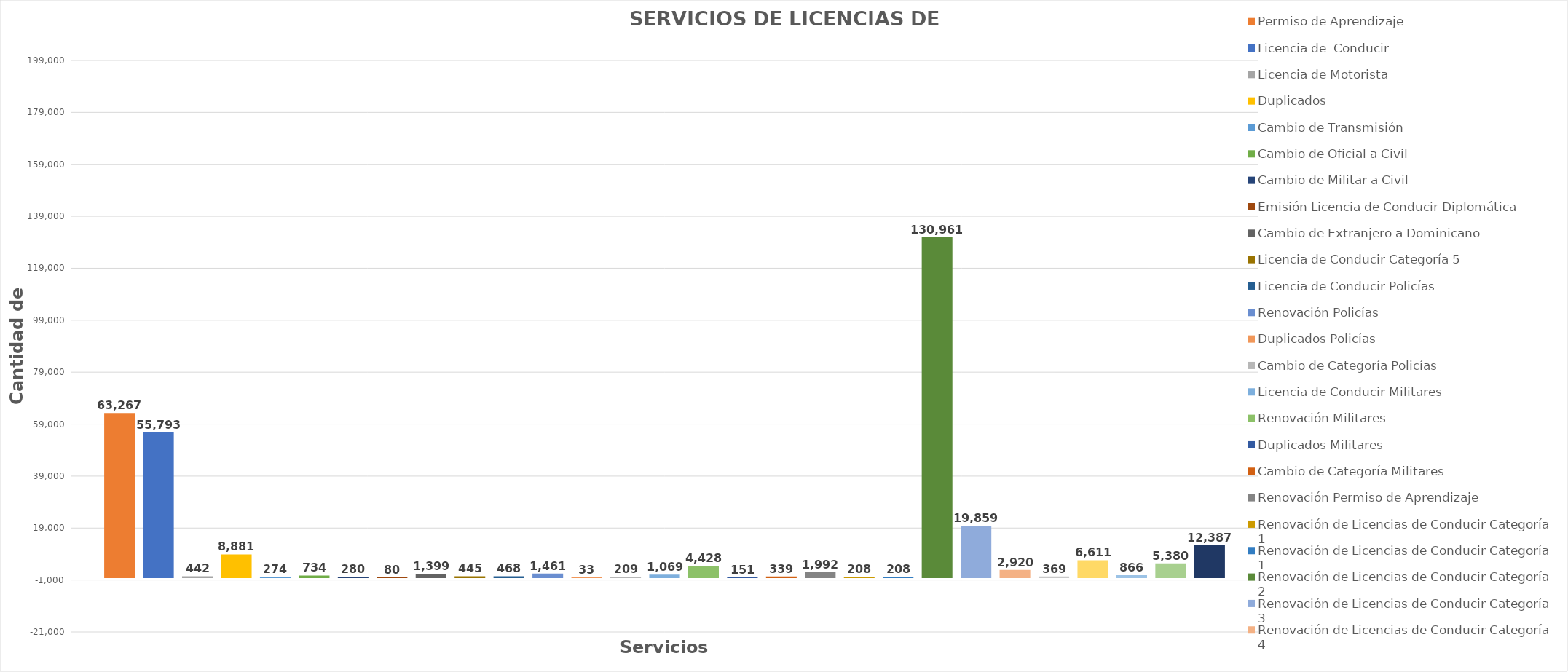
| Category | Permiso de Aprendizaje  | Licencia de  Conducir  | Licencia de Motorista | Duplicados  | Cambio de Transmisión  | Cambio de Oficial a Civil | Cambio de Militar a Civil | Emisión Licencia de Conducir Diplomática | Cambio de Extranjero a Dominicano | Licencia de Conducir Categoría 5 | Licencia de Conducir Policías | Renovación Policías | Duplicados Policías | Cambio de Categoría Policías | Licencia de Conducir Militares | Renovación Militares | Duplicados Militares | Cambio de Categoría Militares | Renovación Permiso de Aprendizaje | Renovación de Licencias de Conducir Categoría 1 | Renovación de Licencias de Conducir Categoría 2 | Renovación de Licencias de Conducir Categoría 3 | Renovación de Licencias de Conducir Categoría 4 | Renovación de Licencias de Conducir Categoría 5 | Cambio de Licencias de Conducir Categoría 2 a 3  | Cambio de Licencias de Conducir Categoría 3 a 4 | Re-Examen Teórico | Re-Examen Práctico |
|---|---|---|---|---|---|---|---|---|---|---|---|---|---|---|---|---|---|---|---|---|---|---|---|---|---|---|---|---|
| 0 | 63267 | 55793 | 442 | 8881 | 274 | 734 | 280 | 80 | 1399 | 445 | 468 | 1461 | 33 | 209 | 1069 | 4428 | 151 | 339 | 1992 | 208 | 130961 | 19859 | 2920 | 369 | 6611 | 866 | 5380 | 12387 |